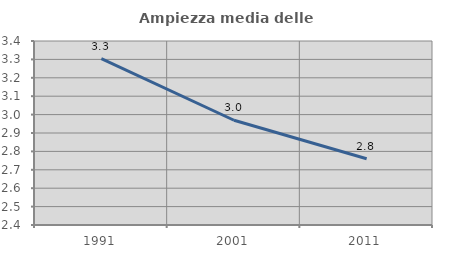
| Category | Ampiezza media delle famiglie |
|---|---|
| 1991.0 | 3.304 |
| 2001.0 | 2.969 |
| 2011.0 | 2.76 |